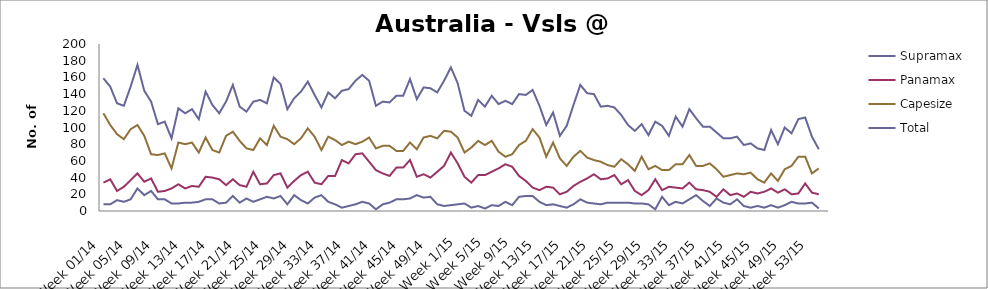
| Category | Supramax | Panamax | Capesize | Total |
|---|---|---|---|---|
| Week 01/14 | 8 | 34 | 117 | 159 |
| Week 02/14 | 8 | 38 | 103 | 149 |
| Week 03/14 | 13 | 24 | 92 | 129 |
| Week 04/14 | 11 | 29 | 86 | 126 |
| Week 05/14 | 14 | 37 | 98 | 149 |
| Week 06/14 | 27 | 45 | 103 | 175 |
| Week 07/14 | 19 | 35 | 90 | 144 |
| Week 08/14 | 24 | 39 | 68 | 131 |
| Week 09/14 | 14 | 23 | 67 | 104 |
| Week 10/14 | 14 | 24 | 69 | 107 |
| Week 11/14 | 9 | 27 | 51 | 87 |
| Week 12/14 | 9 | 32 | 82 | 123 |
| Week 13/14 | 10 | 27 | 80 | 117 |
| Week 14/14 | 10 | 30 | 82 | 122 |
| Week 15/14 | 11 | 29 | 70 | 110 |
| Week 16/14 | 14 | 41 | 88 | 143 |
| Week 17/14 | 14 | 40 | 73 | 127 |
| Week 18/14 | 9 | 38 | 70 | 117 |
| Week 19/14 | 10 | 31 | 90 | 131 |
| Week 20/14 | 18 | 38 | 95 | 151 |
| Week 21/14 | 10 | 31 | 84 | 125 |
| Week 22/14 | 15 | 29 | 75 | 119 |
| Week 23/14 | 11 | 47 | 73 | 131 |
| Week 24/14 | 14 | 32 | 87 | 133 |
| Week 25/14 | 17 | 33 | 79 | 129 |
| Week 26/14 | 15 | 43 | 102 | 160 |
| Week 27/14 | 18 | 45 | 89 | 152 |
| Week 28/14 | 8 | 28 | 86 | 122 |
| Week 29/14 | 19 | 36 | 80 | 135 |
| Week 30/14 | 13 | 43 | 87 | 143 |
| Week 31/14 | 9 | 47 | 99 | 155 |
| Week 32/14 | 16 | 34 | 89 | 139 |
| Week 33/14 | 19 | 32 | 73 | 124 |
| Week 34/14 | 11 | 42 | 89 | 142 |
| Week 35/14 | 8 | 42 | 85 | 135 |
| Week 36/14 | 4 | 61 | 79 | 144 |
| Week 37/14 | 6 | 57 | 83 | 146 |
| Week 38/14 | 8 | 68 | 80 | 156 |
| Week 39/14 | 11 | 69 | 83 | 163 |
| Week 40/14 | 9 | 59 | 88 | 156 |
| Week 41/14 | 2 | 49 | 75 | 126 |
| Week 42/14 | 8 | 45 | 78 | 131 |
| Week 43/14 | 10 | 42 | 78 | 130 |
| Week 44/14 | 14 | 52 | 72 | 138 |
| Week 45/14 | 14 | 52 | 72 | 138 |
| Week 46/14 | 15 | 61 | 82 | 158 |
| Week 47/14 | 19 | 41 | 74 | 134 |
| Week 48/14 | 16 | 44 | 88 | 148 |
| Week 49/14 | 17 | 40 | 90 | 147 |
| Week 50/14 | 8 | 47 | 87 | 142 |
| Week 51/14 | 6 | 54 | 96 | 156 |
| Week 52/14 | 7 | 70 | 95 | 172 |
| Week 1/15 | 8 | 57 | 88 | 153 |
| Week 2/15 | 9 | 41 | 70 | 120 |
| Week 3/15 | 4 | 34 | 76 | 114 |
| Week 4/15 | 6 | 43 | 84 | 133 |
| Week 5/15 | 3 | 43 | 79 | 125 |
| Week 6/15 | 7 | 47 | 84 | 138 |
| Week 7/15 | 6 | 51 | 71 | 128 |
| Week 8/15 | 11 | 56 | 65 | 132 |
| Week 9/15 | 7 | 53 | 68 | 128 |
| Week 10/15 | 17 | 42 | 79 | 140 |
| Week 11/15 | 18 | 36 | 84 | 139 |
| Week 12/15 | 18 | 28 | 98 | 145 |
| Week 13/15 | 11 | 25 | 88 | 126 |
| Week 14/15 | 7 | 29 | 65 | 103 |
| Week 15/15 | 8 | 28 | 82 | 118 |
| Week 16/15 | 6 | 20 | 63 | 90 |
| Week 17/15 | 4 | 23 | 54 | 102 |
| Week 18/15 | 8 | 30 | 65 | 127 |
| Week 19/15 | 14 | 35 | 72 | 151 |
| Week 20/15 | 10 | 39 | 64 | 141 |
| Week 21/15 | 9 | 44 | 61 | 140 |
| Week 22/15 | 8 | 38 | 59 | 125 |
| Week 23/15 | 10 | 39 | 55 | 126 |
| Week 24/15 | 10 | 43 | 53 | 124 |
| Week 25/15 | 10 | 32 | 62 | 115 |
| Week 26/15 | 10 | 37 | 56 | 103 |
| Week 27/15 | 9 | 24 | 48 | 96 |
| Week 28/15 | 9 | 19 | 65 | 104 |
| Week 29/15 | 8 | 25 | 50 | 91 |
| Week 30/15 | 2 | 38 | 54 | 107 |
| Week 31/15 | 17 | 25 | 49 | 102 |
| Week 32/15 | 7 | 29 | 49 | 90 |
| Week 33/15 | 11 | 28 | 56 | 113 |
| Week 34/15 | 9 | 27 | 56 | 101 |
| Week 35/15 | 14 | 34 | 67 | 122 |
| Week 36/15 | 19 | 26 | 54 | 111 |
| Week 37/15 | 12 | 25 | 54 | 101 |
| Week 38/15 | 6 | 23 | 57 | 101 |
| Week 39/15 | 15 | 17 | 50 | 94 |
| Week 40/15 | 10 | 26 | 41 | 87 |
| Week 41/15 | 8 | 19 | 43 | 87 |
| Week 42/15 | 14 | 21 | 45 | 89 |
| Week 43/15 | 6 | 17 | 44 | 79 |
| Week 44/15 | 4 | 23 | 46 | 81 |
| Week 45/15 | 6 | 21 | 38 | 75 |
| Week 46/15 | 4 | 23 | 34 | 73 |
| Week 47/15 | 7 | 27 | 45 | 97 |
| Week 48/15 | 4 | 22 | 36 | 80 |
| Week 49/15 | 7 | 26 | 50 | 100 |
| Week 50/15 | 11 | 20 | 54 | 93 |
| Week 51/15 | 9 | 21 | 65 | 110 |
| Week 52/15 | 9 | 33 | 65 | 112 |
| Week 53/15 | 10 | 22 | 45 | 89 |
| Week 01/16 | 3 | 20 | 51 | 74 |